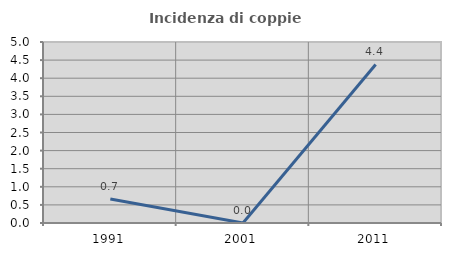
| Category | Incidenza di coppie miste |
|---|---|
| 1991.0 | 0.662 |
| 2001.0 | 0 |
| 2011.0 | 4.38 |